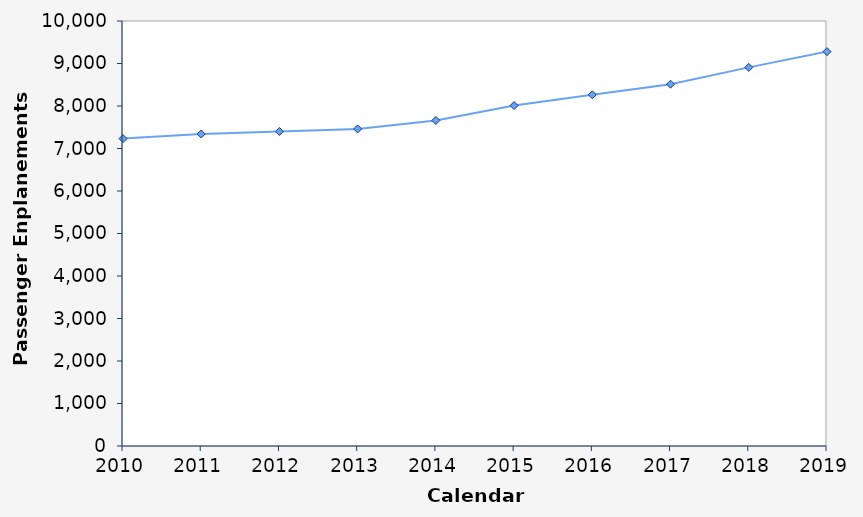
| Category | Passengers (100,000s) |
|---|---|
| 2010.0 | 7232.912 |
| 2011.0 | 7341.547 |
| 2012.0 | 7399.775 |
| 2013.0 | 7459.964 |
| 2014.0 | 7660.432 |
| 2015.0 | 8010.834 |
| 2016.0 | 8263.329 |
| 2017.0 | 8513.017 |
| 2018.0 | 8908.62 |
| 2019.0 | 9279.619 |